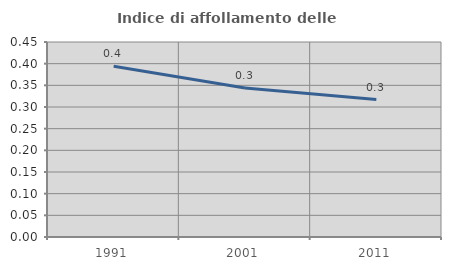
| Category | Indice di affollamento delle abitazioni  |
|---|---|
| 1991.0 | 0.394 |
| 2001.0 | 0.344 |
| 2011.0 | 0.317 |